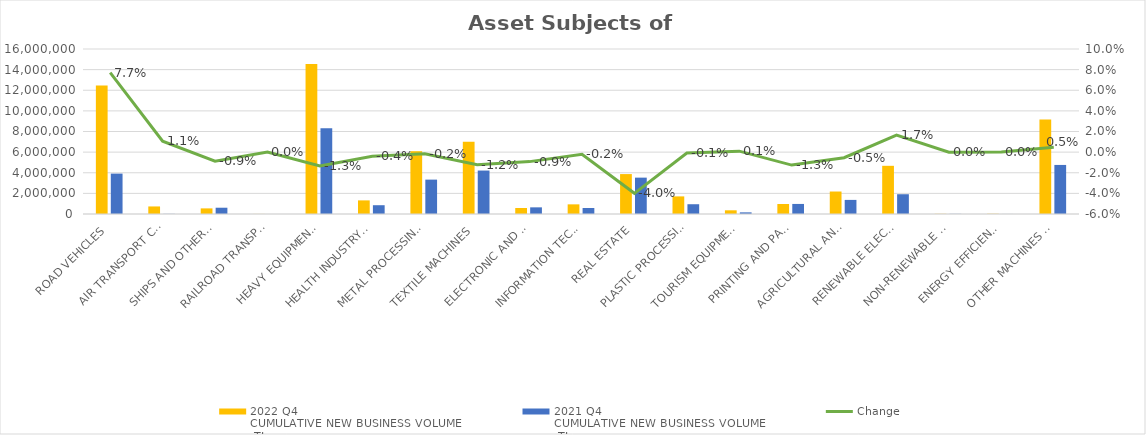
| Category | 2022 Q4 
CUMULATIVE NEW BUSINESS VOLUME
 TL | 2021 Q4 
CUMULATIVE NEW BUSINESS VOLUME
 TL |
|---|---|---|
| ROAD VEHICLES | 12451848.55 | 3916219.461 |
| AIR TRANSPORT CONVEYANCE | 732638 | 12757 |
| SHIPS AND OTHER SEA-GOING VESSELS | 543889.318 | 608730.623 |
| RAILROAD TRANSPORT VEHICLES | 6281 | 293 |
| HEAVY EQUIPMENT AND CONSTRUCTION MACHINERY | 14533810.366 | 8303718.438 |
| HEALTH INDUSTRY AND AESTHETIC INSTRUMENTS | 1319613.476 | 852333.211 |
| METAL PROCESSING MACHINE | 6089279.436 | 3333559.734 |
| TEXTILE MACHINES | 7010397.747 | 4213277.268 |
| ELECTRONIC AND OPTICAL DEVICES | 580877.305 | 645205.98 |
| INFORMATION TECHNOLOGIES AND OFFICE SYSTEMS | 935715.717 | 581077.583 |
| REAL ESTATE | 3871159.281 | 3526176.695 |
| PLASTIC PROCESSING MACHINES | 1707234.762 | 947875.508 |
| TOURISM EQUIPMENT | 358406.217 | 159181.843 |
| PRINTING AND PAPER PROCESSING MACHINES | 968743.128 | 975066.7 |
| AGRICULTURAL AND LIVESTOCK FARMING MACHINES | 2179738.339 | 1367215.798 |
| RENEWABLE ELECTRICITY GENERATION | 4672660.392 | 1917311.087 |
| NON-RENEWABLE ELECTRIC ENERGY GENERATION | 16340.788 | 12734.067 |
| ENERGY EFFICIENCY EQUIPMENT | 20581.342 | 4127.399 |
| OTHER MACHINES AND EQUIPMENT | 9165681.821 | 4757494.876 |